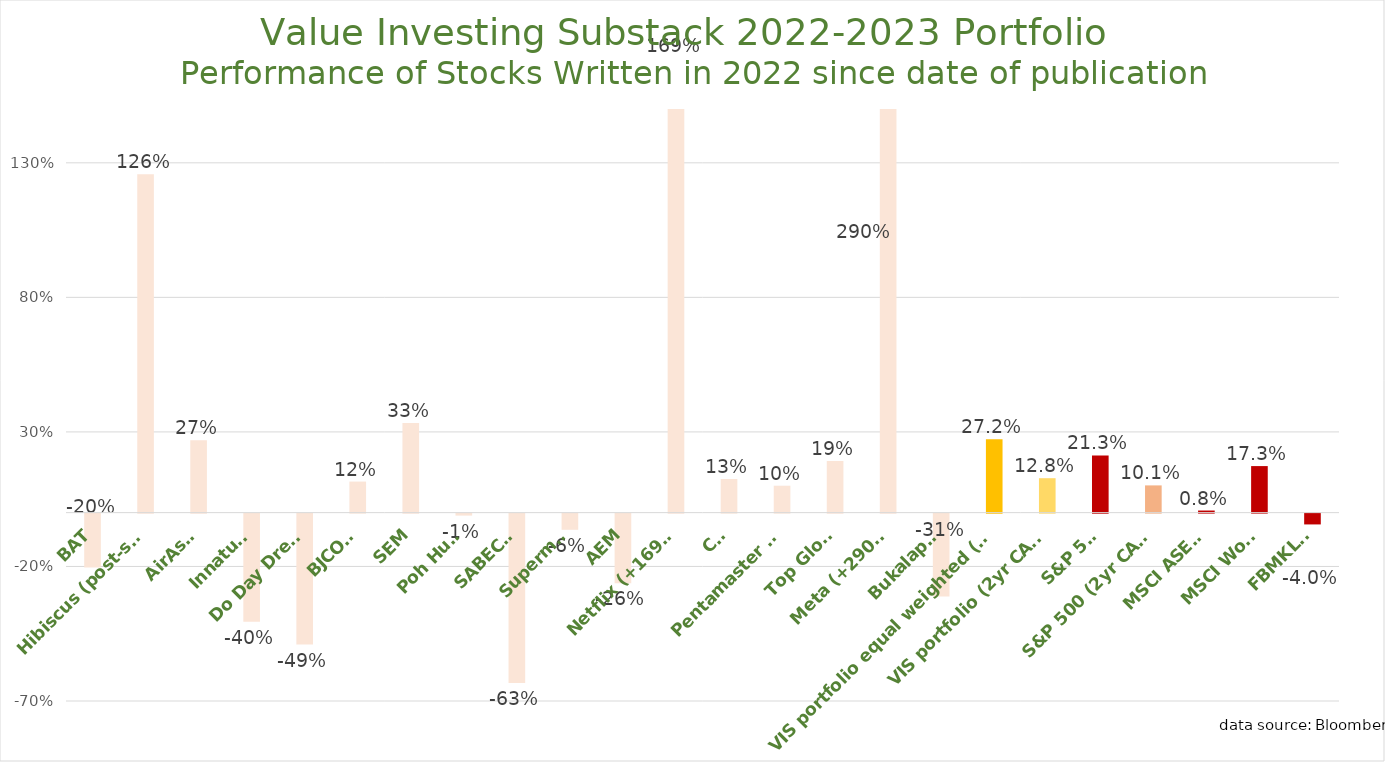
| Category | Series 0 |
|---|---|
| BAT | -0.201 |
| Hibiscus (post-split) | 1.258 |
| AirAsia | 0.269 |
| Innature | -0.402 |
| Do Day Dream | -0.487 |
| BJCORP | 0.115 |
| SEM | 0.333 |
| Poh Huat | -0.007 |
| SABECO | -0.629 |
| Supermax | -0.06 |
| AEM | -0.259 |
| Netflix (+169%) | 1.69 |
| CNI | 0.125 |
| Pentamaster HK | 0.1 |
| Top Glove | 0.192 |
| Meta (+290%) | 2.899 |
| Bukalapak | -0.308 |
| VIS portfolio equal weighted (DCA) | 0.272 |
| VIS portfolio (2yr CAGR) | 0.128 |
| S&P 500 | 0.213 |
| S&P 500 (2yr CAGR) | 0.101 |
| MSCI ASEAN | 0.008 |
| MSCI World | 0.173 |
| FBMKLCI | -0.04 |